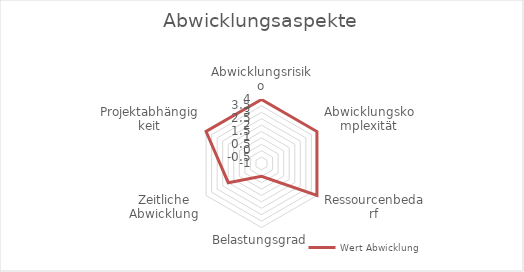
| Category | Wert Abwicklung |
|---|---|
| Abwicklungsrisiko | 4 |
| Abwicklungskomplexität | 4 |
| Ressourcenbedarf | 4 |
| Belastungsgrad | 0 |
| Zeitliche Abwicklung | 2 |
| Projektabhängigkeit | 4 |